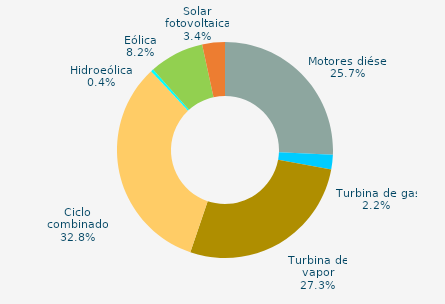
| Category | Series 0 |
|---|---|
| Motores diésel | 25.7 |
| Turbina de gas | 2.2 |
| Turbina de vapor | 27.3 |
| Ciclo combinado | 32.8 |
| Cogeneración | 0 |
| Hidráulica | 0 |
| Hidroeólica | 0.4 |
| Eólica | 8.2 |
| Solar fotovoltaica | 3.4 |
| Otras renovables | 0 |